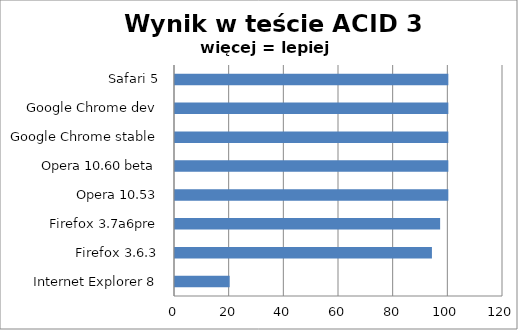
| Category | Series 0 |
|---|---|
| Internet Explorer 8 | 20 |
| Firefox 3.6.3 | 94 |
| Firefox 3.7a6pre | 97 |
| Opera 10.53 | 100 |
| Opera 10.60 beta | 100 |
| Google Chrome stable | 100 |
| Google Chrome dev | 100 |
| Safari 5 | 100 |